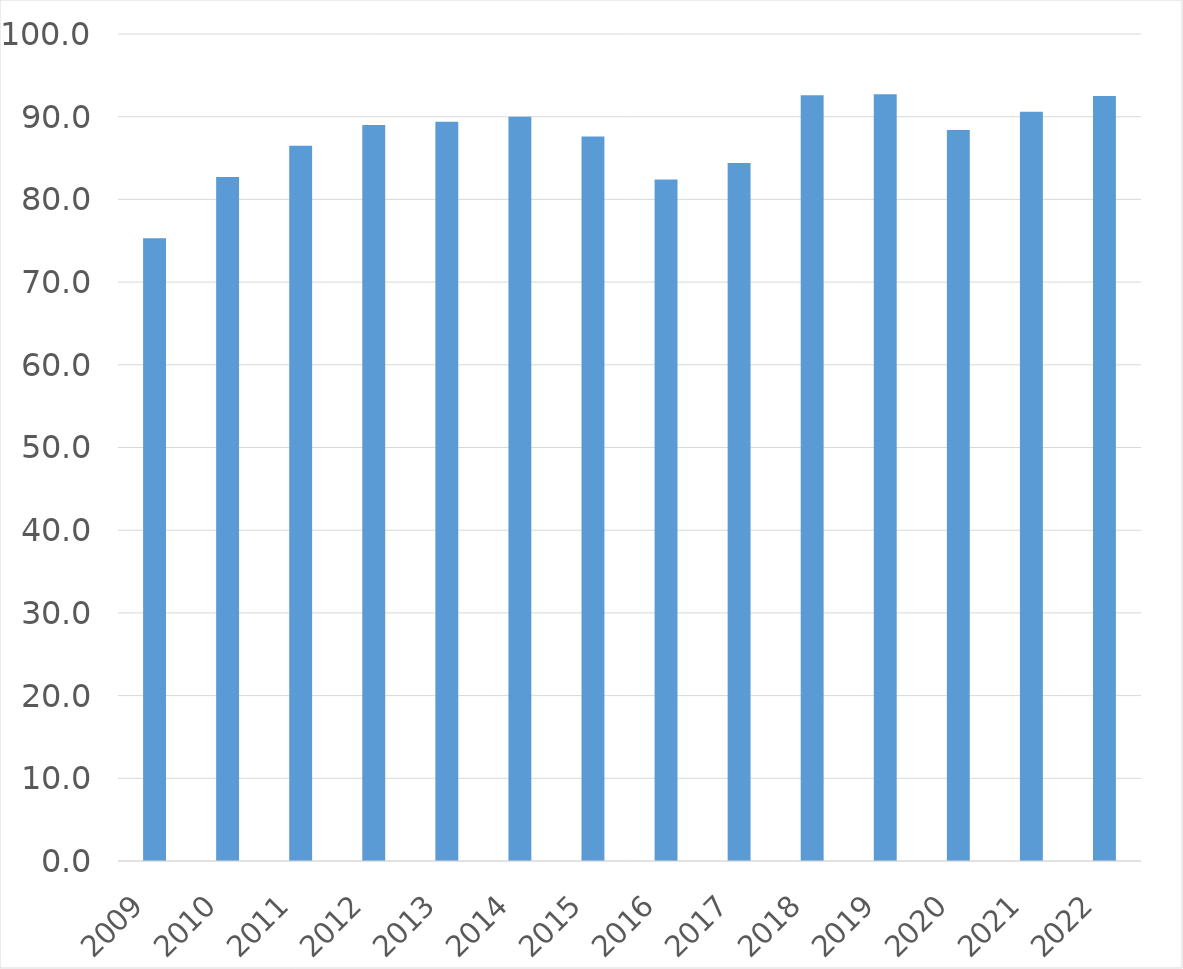
| Category | Series 0 |
|---|---|
| 2009 | 75.3 |
| 2010 | 82.7 |
| 2011 | 86.5 |
| 2012 | 89 |
| 2013 | 89.4 |
| 2014 | 90 |
| 2015 | 87.6 |
| 2016 | 82.4 |
| 2017 | 84.4 |
| 2018 | 92.6 |
| 2019 | 92.7 |
| 2020 | 88.4 |
| 2021 | 90.6 |
| 2022 | 92.5 |